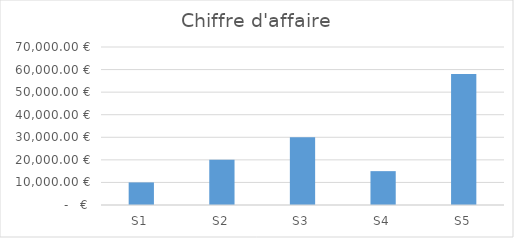
| Category | Chiffre d'affaire |
|---|---|
| S1 | 10000 |
| S2 | 20000 |
| S3 | 30000 |
| S4 | 15000 |
| S5 | 58000 |